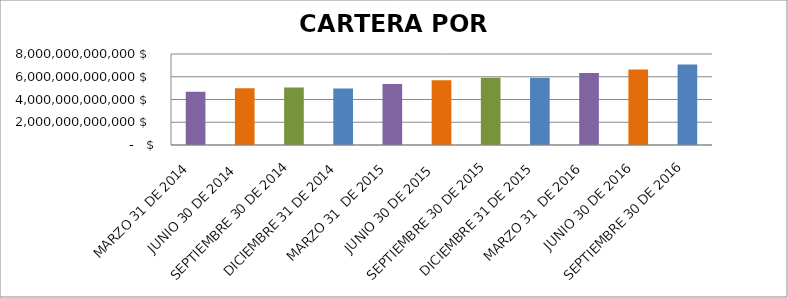
| Category | Series 0 |
|---|---|
| MARZO 31 DE 2014 | 4685695310702 |
| JUNIO 30 DE 2014  | 4997911727705 |
| SEPTIEMBRE 30 DE 2014 | 5056013931767 |
| DICIEMBRE 31 DE 2014 | 4973863172106 |
| MARZO 31  DE 2015 | 5367967437740 |
| JUNIO 30 DE 2015  | 5696573603164 |
| SEPTIEMBRE 30 DE 2015 | 5908435751016 |
| DICIEMBRE 31 DE 2015 | 5922981303022 |
| MARZO 31  DE 2016 | 6333776688944 |
| JUNIO 30 DE 2016 | 6647009005143 |
| SEPTIEMBRE 30 DE 2016 | 7068378037844 |